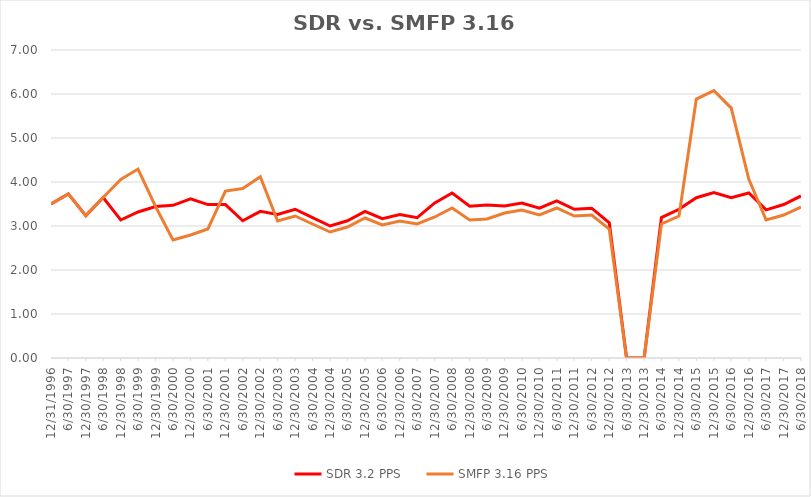
| Category | SDR 3.2 PPS | SMFP 3.16 PPS |
|---|---|---|
| 12/31/96 | 3.5 | 3.5 |
| 6/30/97 | 3.731 | 3.731 |
| 12/31/97 | 3.235 | 3.235 |
| 6/30/98 | 3.647 | 3.647 |
| 12/31/98 | 3.136 | 4.059 |
| 6/30/99 | 3.318 | 4.294 |
| 12/31/99 | 3.441 | 3.441 |
| 6/30/00 | 3.471 | 2.682 |
| 12/31/00 | 3.618 | 2.795 |
| 6/30/01 | 3.486 | 2.932 |
| 12/31/01 | 3.486 | 3.794 |
| 6/30/02 | 3.119 | 3.853 |
| 12/31/02 | 3.333 | 4.118 |
| 6/30/03 | 3.262 | 3.114 |
| 12/31/03 | 3.381 | 3.227 |
| 6/30/04 | 3.19 | 3.045 |
| 12/31/04 | 3 | 2.864 |
| 6/30/05 | 3.119 | 2.977 |
| 12/31/05 | 3.333 | 3.182 |
| 6/30/06 | 3.167 | 3.023 |
| 12/31/06 | 3.262 | 3.114 |
| 6/30/07 | 3.19 | 3.045 |
| 12/31/07 | 3.525 | 3.205 |
| 6/30/08 | 3.75 | 3.409 |
| 12/31/08 | 3.45 | 3.136 |
| 6/30/09 | 3.475 | 3.159 |
| 12/31/09 | 3.452 | 3.295 |
| 6/30/10 | 3.524 | 3.364 |
| 12/31/10 | 3.405 | 3.25 |
| 6/30/11 | 3.571 | 3.409 |
| 12/31/11 | 3.381 | 3.227 |
| 6/30/12 | 3.405 | 3.25 |
| 12/31/12 | 3.071 | 2.932 |
| 6/30/13 | 0 | 0 |
| 12/31/13 | 0 | 0 |
| 6/30/14 | 3.19 | 3.045 |
| 12/31/14 | 3.381 | 3.227 |
| 6/30/15 | 3.643 | 5.885 |
| 12/31/15 | 3.762 | 6.077 |
| 6/30/16 | 3.643 | 5.68 |
| 12/31/16 | 3.75 | 4.061 |
| 6/30/17 | 3.366 | 3.136 |
| 12/31/17 | 3.488 | 3.25 |
| 6/30/18 | 3.683 | 3.432 |